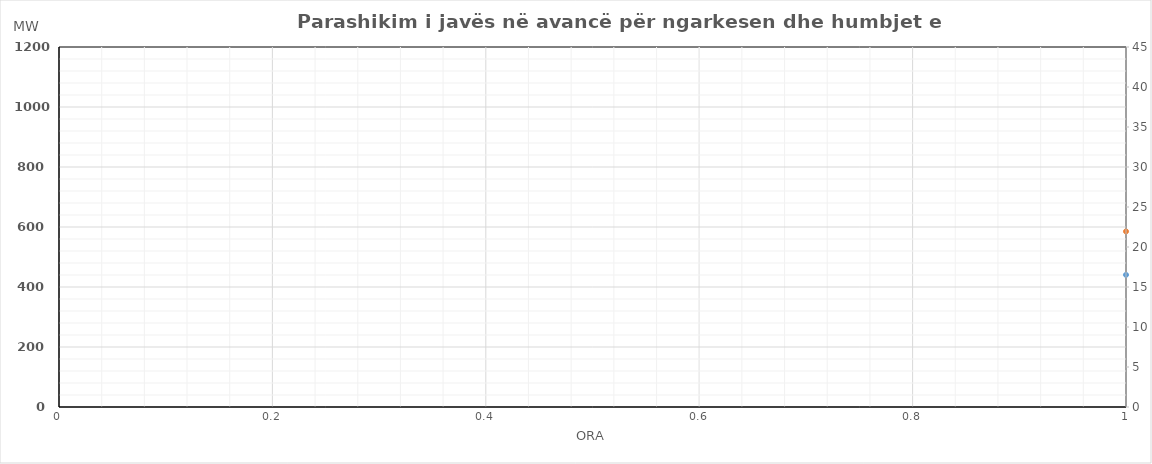
| Category | Ngarkesa (MWh) |
|---|---|
| 0 | 585.28 |
| 1 | 572.46 |
| 2 | 574.23 |
| 3 | 571.53 |
| 4 | 570.95 |
| 5 | 569.23 |
| 6 | 598.6 |
| 7 | 670.47 |
| 8 | 742.42 |
| 9 | 776.61 |
| 10 | 793.31 |
| 11 | 793.41 |
| 12 | 796.13 |
| 13 | 784.95 |
| 14 | 750.18 |
| 15 | 728.83 |
| 16 | 739.82 |
| 17 | 769.92 |
| 18 | 806.05 |
| 19 | 830.57 |
| 20 | 886.83 |
| 21 | 883.83 |
| 22 | 794.77 |
| 23 | 679.83 |
| 24 | 584.28 |
| 25 | 580.56 |
| 26 | 579.23 |
| 27 | 579.63 |
| 28 | 580.05 |
| 29 | 579.63 |
| 30 | 631.1 |
| 31 | 738.07 |
| 32 | 795.12 |
| 33 | 801.61 |
| 34 | 794.31 |
| 35 | 799.21 |
| 36 | 799.13 |
| 37 | 811.45 |
| 38 | 790.68 |
| 39 | 776.93 |
| 40 | 787.82 |
| 41 | 805.72 |
| 42 | 828.45 |
| 43 | 850.97 |
| 44 | 889.03 |
| 45 | 879.83 |
| 46 | 824.87 |
| 47 | 717.53 |
| 48 | 614.242 |
| 49 | 565.663 |
| 50 | 549.16 |
| 51 | 548.675 |
| 52 | 546.781 |
| 53 | 577.807 |
| 54 | 672.57 |
| 55 | 783.012 |
| 56 | 832.617 |
| 57 | 839.583 |
| 58 | 838.461 |
| 59 | 855.079 |
| 60 | 847.431 |
| 61 | 853.058 |
| 62 | 796.505 |
| 63 | 778.303 |
| 64 | 781.194 |
| 65 | 803.992 |
| 66 | 820.543 |
| 67 | 836.59 |
| 68 | 879.356 |
| 69 | 868.257 |
| 70 | 822.198 |
| 71 | 708.866 |
| 72 | 565.4 |
| 73 | 515.31 |
| 74 | 509.41 |
| 75 | 508.41 |
| 76 | 507.93 |
| 77 | 533.06 |
| 78 | 644.5 |
| 79 | 793.8 |
| 80 | 840.81 |
| 81 | 825.4 |
| 82 | 835.32 |
| 83 | 826.53 |
| 84 | 840.8 |
| 85 | 841.99 |
| 86 | 882.19 |
| 87 | 883.44 |
| 88 | 874.42 |
| 89 | 883.54 |
| 90 | 927.05 |
| 91 | 973.38 |
| 92 | 1025.5 |
| 93 | 974.61 |
| 94 | 858.81 |
| 95 | 732.01 |
| 96 | 602.21 |
| 97 | 546.75 |
| 98 | 525.41 |
| 99 | 520.09 |
| 100 | 528.42 |
| 101 | 573.08 |
| 102 | 686.36 |
| 103 | 852.9 |
| 104 | 908.38 |
| 105 | 904.28 |
| 106 | 839.24 |
| 107 | 827.21 |
| 108 | 765.13 |
| 109 | 766.12 |
| 110 | 792.36 |
| 111 | 798.42 |
| 112 | 814.5 |
| 113 | 845.02 |
| 114 | 879.41 |
| 115 | 950.37 |
| 116 | 1000.41 |
| 117 | 919.64 |
| 118 | 814.19 |
| 119 | 681.57 |
| 120 | 589.1 |
| 121 | 535.57 |
| 122 | 516.22 |
| 123 | 505.05 |
| 124 | 514.37 |
| 125 | 556.03 |
| 126 | 654.46 |
| 127 | 782.07 |
| 128 | 870.24 |
| 129 | 879.15 |
| 130 | 850.43 |
| 131 | 835.91 |
| 132 | 834.5 |
| 133 | 871.32 |
| 134 | 855.09 |
| 135 | 837.86 |
| 136 | 842.71 |
| 137 | 869.14 |
| 138 | 860.65 |
| 139 | 911.45 |
| 140 | 982 |
| 141 | 913.92 |
| 142 | 790.32 |
| 143 | 697.43 |
| 144 | 653.6 |
| 145 | 597.17 |
| 146 | 555.92 |
| 147 | 528.45 |
| 148 | 524.07 |
| 149 | 548.23 |
| 150 | 615.26 |
| 151 | 706.77 |
| 152 | 783.44 |
| 153 | 817.55 |
| 154 | 836.83 |
| 155 | 891.51 |
| 156 | 884.6 |
| 157 | 865.62 |
| 158 | 833.09 |
| 159 | 818.76 |
| 160 | 762.01 |
| 161 | 795.54 |
| 162 | 812.65 |
| 163 | 885.55 |
| 164 | 965.2 |
| 165 | 916.02 |
| 166 | 810.92 |
| 167 | 687.63 |